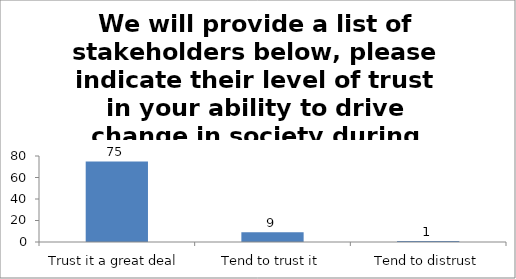
| Category | We will provide a list of stakeholders below, please indicate their level of trust in your ability to drive change in society during studies. (Parents) |
|---|---|
| Trust it a great deal | 75 |
| Tend to trust it | 9 |
| Tend to distrust | 1 |